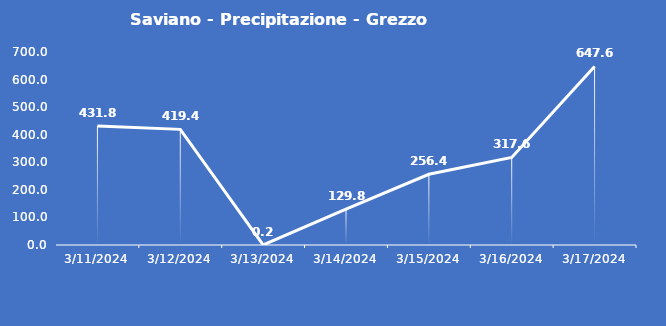
| Category | Saviano - Precipitazione - Grezzo (mm) |
|---|---|
| 3/11/24 | 431.8 |
| 3/12/24 | 419.4 |
| 3/13/24 | 0.2 |
| 3/14/24 | 129.8 |
| 3/15/24 | 256.4 |
| 3/16/24 | 317.6 |
| 3/17/24 | 647.6 |